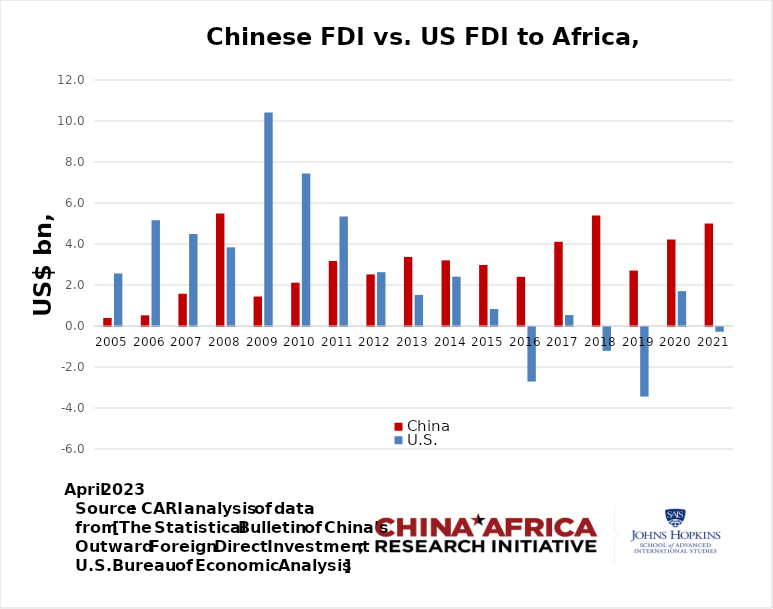
| Category | China | U.S. |
|---|---|---|
| 2005.0 | 0.392 | 2.564 |
| 2006.0 | 0.52 | 5.157 |
| 2007.0 | 1.574 | 4.49 |
| 2008.0 | 5.491 | 3.837 |
| 2009.0 | 1.439 | 10.417 |
| 2010.0 | 2.112 | 7.442 |
| 2011.0 | 3.173 | 5.34 |
| 2012.0 | 2.517 | 2.624 |
| 2013.0 | 3.371 | 1.516 |
| 2014.0 | 3.202 | 2.405 |
| 2015.0 | 2.978 | 0.829 |
| 2016.0 | 2.399 | -2.66 |
| 2017.0 | 4.105 | 0.534 |
| 2018.0 | 5.389 | -1.164 |
| 2019.0 | 2.704 | -3.393 |
| 2020.0 | 4.226 | 1.7 |
| 2021.0 | 5 | -0.23 |